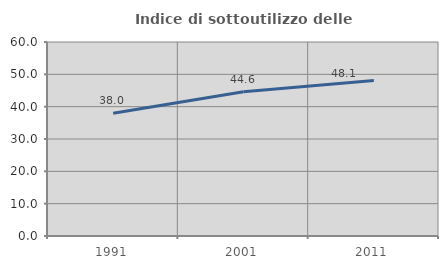
| Category | Indice di sottoutilizzo delle abitazioni  |
|---|---|
| 1991.0 | 37.956 |
| 2001.0 | 44.598 |
| 2011.0 | 48.067 |